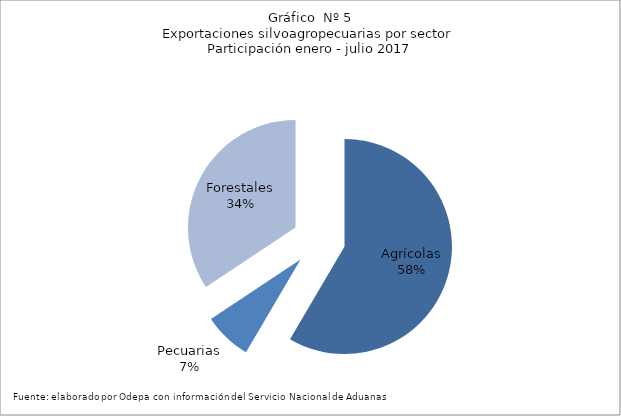
| Category | Series 0 |
|---|---|
| Agrícolas | 5629561 |
| Pecuarias | 694774 |
| Forestales | 3305521 |